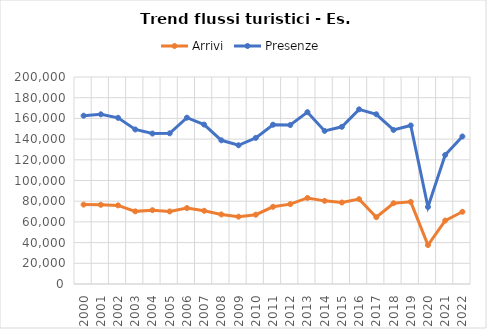
| Category | Arrivi | Presenze |
|---|---|---|
| 2000.0 | 76709 | 162623 |
| 2001.0 | 76527 | 163954 |
| 2002.0 | 75952 | 160565 |
| 2003.0 | 70174 | 149312 |
| 2004.0 | 71310 | 145365 |
| 2005.0 | 70098 | 145586 |
| 2006.0 | 73388 | 160682 |
| 2007.0 | 70740 | 154039 |
| 2008.0 | 67185 | 138857 |
| 2009.0 | 65080 | 134033 |
| 2010.0 | 66975 | 141170 |
| 2011.0 | 74604 | 153892 |
| 2012.0 | 77161 | 153591 |
| 2013.0 | 83128 | 166039 |
| 2014.0 | 80328 | 147931 |
| 2015.0 | 78744 | 151870 |
| 2016.0 | 81994 | 168764 |
| 2017.0 | 64555 | 163974 |
| 2018.0 | 78033 | 148870 |
| 2019.0 | 79369 | 153196 |
| 2020.0 | 37632 | 74419 |
| 2021.0 | 61245 | 124664 |
| 2022.0 | 69787 | 142528 |